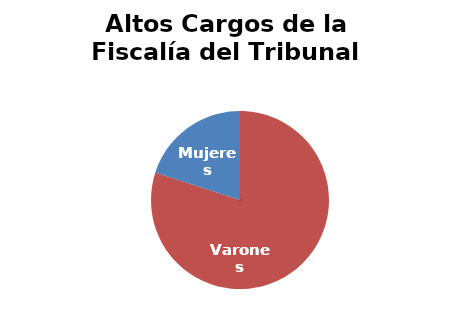
| Category | Altos Cargos de la Fiscalía del Tribunal Supremo |
|---|---|
| Varones | 12 |
| Mujeres | 3 |